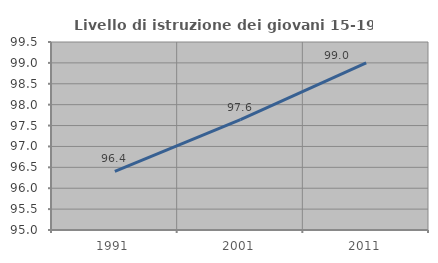
| Category | Livello di istruzione dei giovani 15-19 anni |
|---|---|
| 1991.0 | 96.406 |
| 2001.0 | 97.642 |
| 2011.0 | 99.002 |